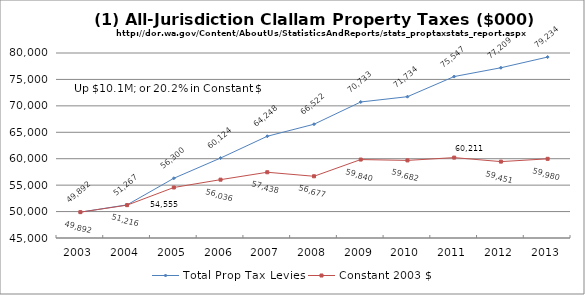
| Category | Total Prop Tax Levies | Constant 2003 $ |
|---|---|---|
| 2003.0 | 49891.88 | 49891.88 |
| 2004.0 | 51267.083 | 51215.816 |
| 2005.0 | 56300.215 | 54554.908 |
| 2006.0 | 60124.098 | 56035.659 |
| 2007.0 | 64248.196 | 57437.887 |
| 2008.0 | 66522.384 | 56677.071 |
| 2009.0 | 70732.996 | 59840.115 |
| 2010.0 | 71733.589 | 59682.346 |
| 2011.0 | 75547.057 | 60211.004 |
| 2012.0 | 77208.949 | 59450.89 |
| 2013.0 | 79233.616 | 59979.847 |